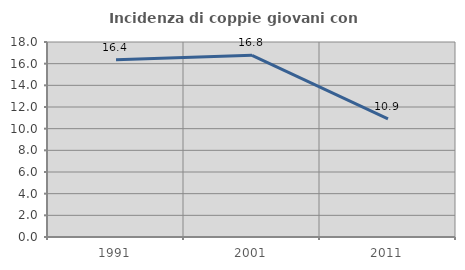
| Category | Incidenza di coppie giovani con figli |
|---|---|
| 1991.0 | 16.373 |
| 2001.0 | 16.768 |
| 2011.0 | 10.913 |